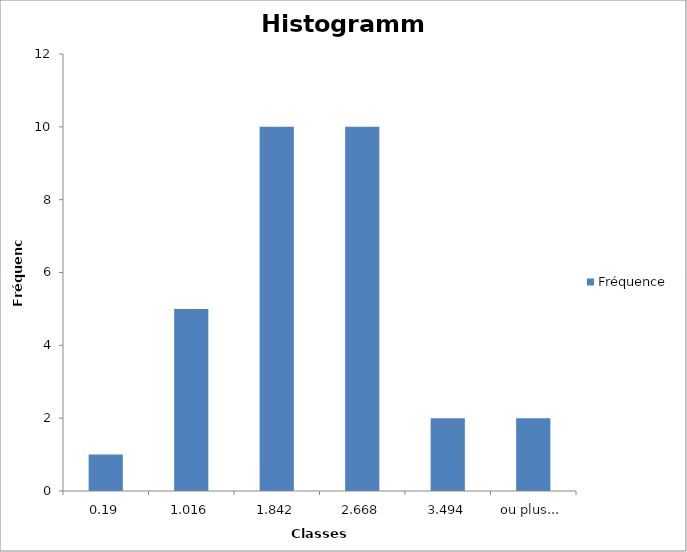
| Category | Fréquence |
|---|---|
| 0,19 | 1 |
| 1,016 | 5 |
| 1,842 | 10 |
| 2,668 | 10 |
| 3,494 | 2 |
| ou plus... | 2 |